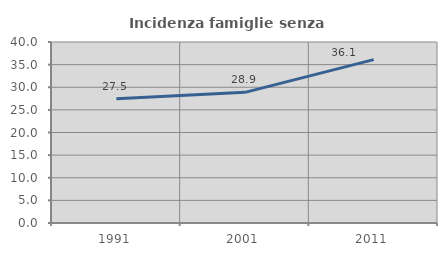
| Category | Incidenza famiglie senza nuclei |
|---|---|
| 1991.0 | 27.457 |
| 2001.0 | 28.876 |
| 2011.0 | 36.099 |